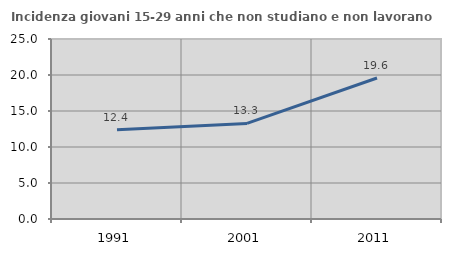
| Category | Incidenza giovani 15-29 anni che non studiano e non lavorano  |
|---|---|
| 1991.0 | 12.392 |
| 2001.0 | 13.276 |
| 2011.0 | 19.584 |